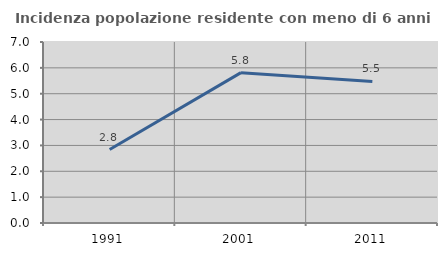
| Category | Incidenza popolazione residente con meno di 6 anni |
|---|---|
| 1991.0 | 2.841 |
| 2001.0 | 5.814 |
| 2011.0 | 5.477 |